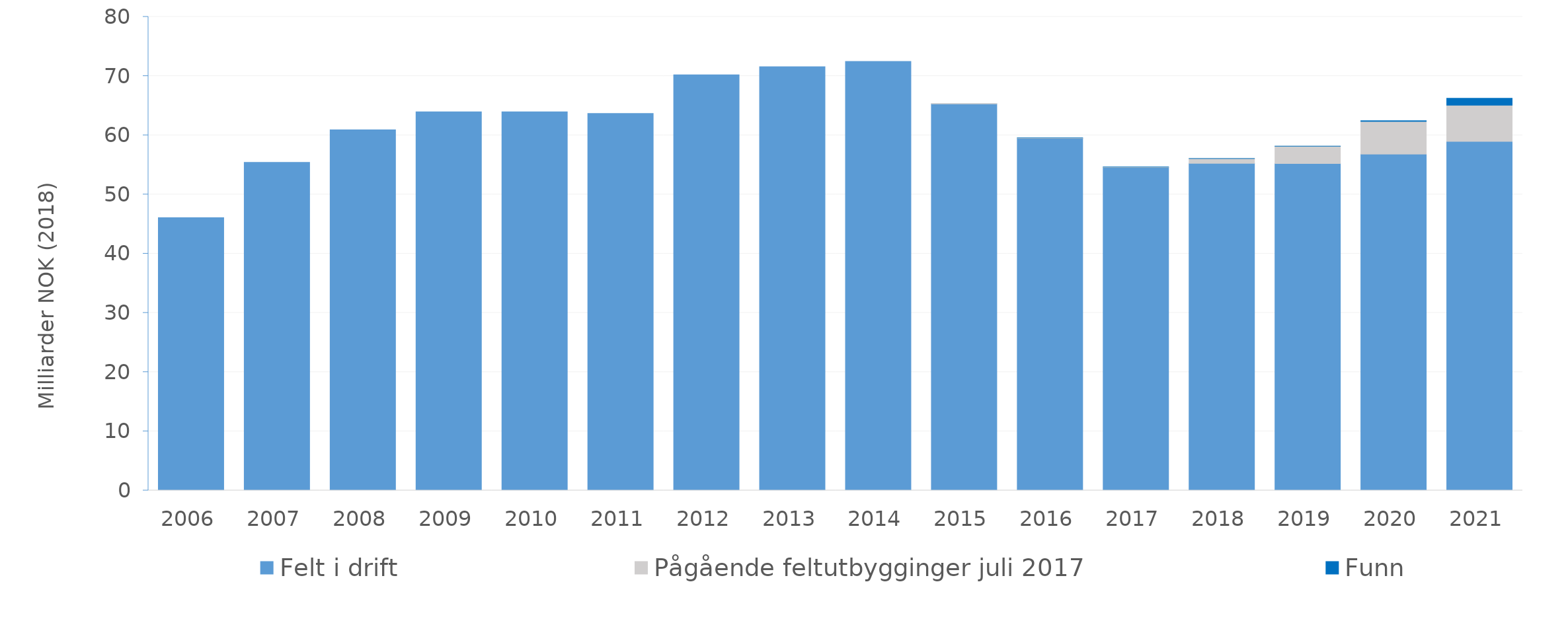
| Category | Felt i drift | Pågående feltutbygginger juli 2017 | Funn |
|---|---|---|---|
| 2006.0 | 46.086 | 0 | 0 |
| 2007.0 | 55.415 | 0 | 0 |
| 2008.0 | 60.912 | 0 | 0 |
| 2009.0 | 63.969 | 0 | 0 |
| 2010.0 | 63.97 | 0 | 0 |
| 2011.0 | 63.692 | 0 | 0 |
| 2012.0 | 70.2 | 0 | 0 |
| 2013.0 | 71.566 | 0 | 0 |
| 2014.0 | 72.457 | 0 | 0 |
| 2015.0 | 65.313 | 0.029 | 0 |
| 2016.0 | 59.476 | 0.078 | 0.003 |
| 2017.0 | 54.548 | 0.089 | 0.003 |
| 2018.0 | 55.256 | 0.814 | 0.011 |
| 2019.0 | 55.233 | 2.917 | 0.019 |
| 2020.0 | 56.825 | 5.532 | 0.084 |
| 2021.0 | 58.976 | 6.11 | 1.168 |